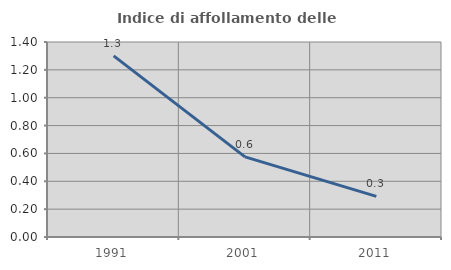
| Category | Indice di affollamento delle abitazioni  |
|---|---|
| 1991.0 | 1.301 |
| 2001.0 | 0.576 |
| 2011.0 | 0.292 |